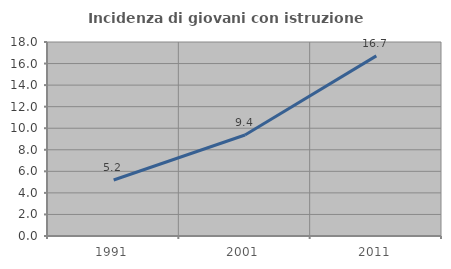
| Category | Incidenza di giovani con istruzione universitaria |
|---|---|
| 1991.0 | 5.195 |
| 2001.0 | 9.375 |
| 2011.0 | 16.713 |